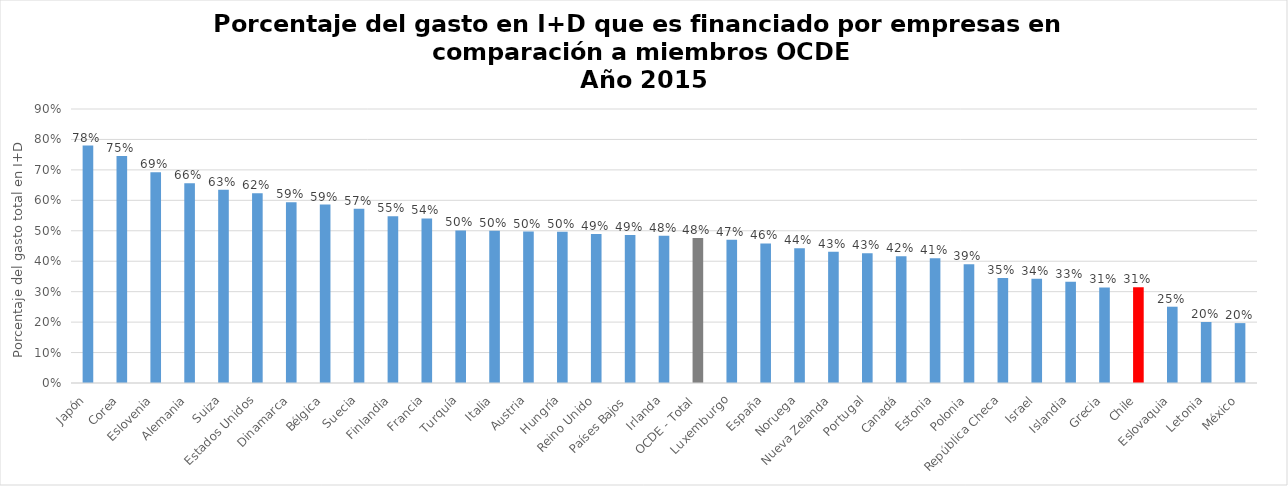
| Category | Series 0 |
|---|---|
| Japón | 0.78 |
| Corea | 0.745 |
| Eslovenia | 0.692 |
| Alemania | 0.656 |
| Suiza | 0.635 |
| Estados Unidos | 0.624 |
| Dinamarca | 0.594 |
| Bélgica | 0.586 |
| Suecia | 0.573 |
| Finlandia | 0.548 |
| Francia | 0.54 |
| Turquía | 0.501 |
| Italia | 0.5 |
| Austria | 0.497 |
| Hungría | 0.497 |
| Reino Unido | 0.49 |
| Países Bajos | 0.486 |
| Irlanda | 0.484 |
| OCDE - Total | 0.476 |
| Luxemburgo | 0.471 |
| España | 0.458 |
| Noruega | 0.442 |
| Nueva Zelanda | 0.431 |
| Portugal | 0.427 |
| Canadá | 0.416 |
| Estonia | 0.41 |
| Polonia | 0.39 |
| República Checa | 0.345 |
| Israel | 0.343 |
| Islandia | 0.333 |
| Grecia | 0.314 |
| Chile | 0.314 |
| Eslovaquia | 0.251 |
| Letonia | 0.2 |
| México | 0.197 |